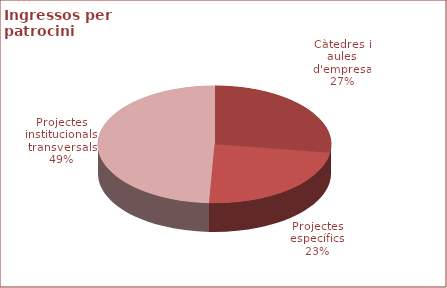
| Category | Series 0 |
|---|---|
| Càtedres i aules d'empresa | 1465140 |
| Projectes específics | 1260867 |
| Projectes institucionals transversals | 2645000 |